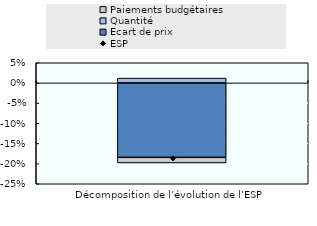
| Category | Ecart de prix | Quantité | Paiements budgétaires |
|---|---|---|---|
| Décomposition de l’évolution de l’ESP | -0.185 | 0.012 | -0.014 |